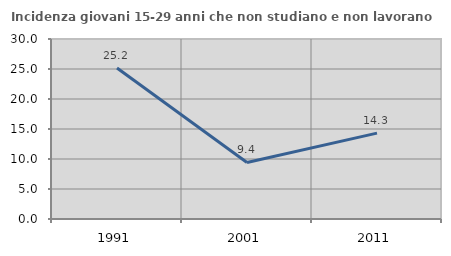
| Category | Incidenza giovani 15-29 anni che non studiano e non lavorano  |
|---|---|
| 1991.0 | 25.163 |
| 2001.0 | 9.428 |
| 2011.0 | 14.308 |